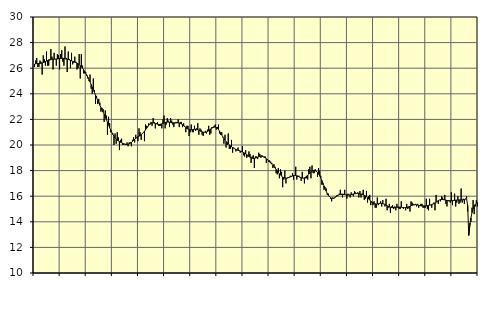
| Category | Tillverkning o utvinning, energi o miljö, SNI 05-33, 35-39 | Series 3 |
|---|---|---|
| nan | 26.1 | 26.31 |
| 87.0 | 26.6 | 26.35 |
| 87.0 | 26.8 | 26.36 |
| 87.0 | 26.1 | 26.37 |
| 87.0 | 26.1 | 26.37 |
| 87.0 | 26.6 | 26.38 |
| 87.0 | 26.5 | 26.39 |
| 87.0 | 25.5 | 26.41 |
| 87.0 | 27 | 26.44 |
| 87.0 | 26.7 | 26.47 |
| 87.0 | 26.2 | 26.51 |
| 87.0 | 27.3 | 26.56 |
| nan | 26.2 | 26.61 |
| 88.0 | 26.2 | 26.65 |
| 88.0 | 26.6 | 26.67 |
| 88.0 | 27.5 | 26.69 |
| 88.0 | 26.9 | 26.7 |
| 88.0 | 25.9 | 26.7 |
| 88.0 | 27.2 | 26.7 |
| 88.0 | 26.7 | 26.71 |
| 88.0 | 26.2 | 26.72 |
| 88.0 | 27.1 | 26.72 |
| 88.0 | 27 | 26.74 |
| 88.0 | 25.9 | 26.75 |
| nan | 27.1 | 26.76 |
| 89.0 | 27.4 | 26.77 |
| 89.0 | 26.5 | 26.77 |
| 89.0 | 26.2 | 26.76 |
| 89.0 | 27.7 | 26.74 |
| 89.0 | 26.8 | 26.72 |
| 89.0 | 25.7 | 26.7 |
| 89.0 | 27.3 | 26.68 |
| 89.0 | 26.7 | 26.65 |
| 89.0 | 26 | 26.61 |
| 89.0 | 27.2 | 26.58 |
| 89.0 | 26.3 | 26.54 |
| nan | 26.4 | 26.51 |
| 90.0 | 26.9 | 26.48 |
| 90.0 | 26.5 | 26.44 |
| 90.0 | 25.9 | 26.4 |
| 90.0 | 26 | 26.34 |
| 90.0 | 27.1 | 26.28 |
| 90.0 | 25.2 | 26.2 |
| 90.0 | 27.1 | 26.11 |
| 90.0 | 26.2 | 26.01 |
| 90.0 | 25.6 | 25.89 |
| 90.0 | 25.6 | 25.76 |
| 90.0 | 25.7 | 25.61 |
| nan | 25.4 | 25.46 |
| 91.0 | 25.2 | 25.29 |
| 91.0 | 25 | 25.1 |
| 91.0 | 25.5 | 24.92 |
| 91.0 | 24.4 | 24.73 |
| 91.0 | 24 | 24.53 |
| 91.0 | 25.2 | 24.33 |
| 91.0 | 24.3 | 24.12 |
| 91.0 | 23.2 | 23.91 |
| 91.0 | 23.8 | 23.7 |
| 91.0 | 23.2 | 23.49 |
| 91.0 | 23.6 | 23.3 |
| nan | 23.3 | 23.11 |
| 92.0 | 22.6 | 22.93 |
| 92.0 | 22.9 | 22.75 |
| 92.0 | 22.8 | 22.57 |
| 92.0 | 21.8 | 22.39 |
| 92.0 | 22.7 | 22.2 |
| 92.0 | 22.3 | 22 |
| 92.0 | 20.8 | 21.78 |
| 92.0 | 22.2 | 21.57 |
| 92.0 | 21.7 | 21.36 |
| 92.0 | 21 | 21.17 |
| 92.0 | 21 | 20.98 |
| nan | 20.9 | 20.82 |
| 93.0 | 20 | 20.68 |
| 93.0 | 20.9 | 20.56 |
| 93.0 | 20.1 | 20.46 |
| 93.0 | 21 | 20.38 |
| 93.0 | 20.6 | 20.32 |
| 93.0 | 19.6 | 20.27 |
| 93.0 | 20.4 | 20.22 |
| 93.0 | 20.5 | 20.18 |
| 93.0 | 20 | 20.13 |
| 93.0 | 20 | 20.09 |
| 93.0 | 20.1 | 20.06 |
| nan | 20 | 20.04 |
| 94.0 | 20.2 | 20.04 |
| 94.0 | 19.9 | 20.06 |
| 94.0 | 20.2 | 20.09 |
| 94.0 | 20.2 | 20.14 |
| 94.0 | 19.9 | 20.2 |
| 94.0 | 20.4 | 20.28 |
| 94.0 | 20.6 | 20.36 |
| 94.0 | 20.2 | 20.44 |
| 94.0 | 20.8 | 20.52 |
| 94.0 | 20.6 | 20.58 |
| 94.0 | 20.3 | 20.64 |
| nan | 21.3 | 20.69 |
| 95.0 | 21 | 20.74 |
| 95.0 | 20.4 | 20.8 |
| 95.0 | 20.9 | 20.88 |
| 95.0 | 21 | 20.97 |
| 95.0 | 20.3 | 21.07 |
| 95.0 | 21.6 | 21.19 |
| 95.0 | 21.5 | 21.32 |
| 95.0 | 21.4 | 21.44 |
| 95.0 | 21.7 | 21.55 |
| 95.0 | 21.6 | 21.64 |
| 95.0 | 21.8 | 21.7 |
| nan | 21.5 | 21.73 |
| 96.0 | 22.1 | 21.73 |
| 96.0 | 21.8 | 21.71 |
| 96.0 | 21.3 | 21.68 |
| 96.0 | 21.7 | 21.65 |
| 96.0 | 21.8 | 21.62 |
| 96.0 | 21.5 | 21.61 |
| 96.0 | 21.5 | 21.61 |
| 96.0 | 21.5 | 21.63 |
| 96.0 | 21.3 | 21.65 |
| 96.0 | 22 | 21.69 |
| 96.0 | 22.3 | 21.73 |
| nan | 21.3 | 21.76 |
| 97.0 | 21.6 | 21.78 |
| 97.0 | 22.1 | 21.79 |
| 97.0 | 21.9 | 21.79 |
| 97.0 | 21.4 | 21.78 |
| 97.0 | 22.1 | 21.76 |
| 97.0 | 21.9 | 21.75 |
| 97.0 | 21.6 | 21.74 |
| 97.0 | 21.4 | 21.73 |
| 97.0 | 21.7 | 21.73 |
| 97.0 | 21.8 | 21.73 |
| 97.0 | 21.8 | 21.73 |
| nan | 22 | 21.73 |
| 98.0 | 21.4 | 21.71 |
| 98.0 | 21.8 | 21.69 |
| 98.0 | 21.8 | 21.64 |
| 98.0 | 21.4 | 21.59 |
| 98.0 | 21.7 | 21.52 |
| 98.0 | 21.5 | 21.44 |
| 98.0 | 21 | 21.36 |
| 98.0 | 21.5 | 21.3 |
| 98.0 | 21.5 | 21.25 |
| 98.0 | 20.7 | 21.21 |
| 98.0 | 21 | 21.19 |
| nan | 21.6 | 21.19 |
| 99.0 | 21 | 21.2 |
| 99.0 | 21 | 21.22 |
| 99.0 | 21.5 | 21.23 |
| 99.0 | 21.1 | 21.23 |
| 99.0 | 21.3 | 21.22 |
| 99.0 | 21.7 | 21.19 |
| 99.0 | 20.8 | 21.16 |
| 99.0 | 21.3 | 21.11 |
| 99.0 | 21.2 | 21.07 |
| 99.0 | 20.8 | 21.03 |
| 99.0 | 20.7 | 21 |
| nan | 21 | 20.99 |
| 0.0 | 21.1 | 20.99 |
| 0.0 | 20.9 | 21.02 |
| 0.0 | 21.2 | 21.06 |
| 0.0 | 21.5 | 21.12 |
| 0.0 | 20.8 | 21.19 |
| 0.0 | 20.9 | 21.26 |
| 0.0 | 21.4 | 21.32 |
| 0.0 | 21.4 | 21.37 |
| 0.0 | 21.5 | 21.4 |
| 0.0 | 21.6 | 21.4 |
| 0.0 | 21.2 | 21.37 |
| nan | 21.4 | 21.3 |
| 1.0 | 21.6 | 21.21 |
| 1.0 | 20.9 | 21.08 |
| 1.0 | 20.8 | 20.94 |
| 1.0 | 21 | 20.79 |
| 1.0 | 20.6 | 20.64 |
| 1.0 | 20.1 | 20.5 |
| 1.0 | 20.8 | 20.38 |
| 1.0 | 19.8 | 20.27 |
| 1.0 | 20 | 20.18 |
| 1.0 | 20.9 | 20.09 |
| 1.0 | 19.7 | 20.01 |
| nan | 19.7 | 19.94 |
| 2.0 | 20.4 | 19.87 |
| 2.0 | 19.4 | 19.8 |
| 2.0 | 19.8 | 19.75 |
| 2.0 | 19.7 | 19.7 |
| 2.0 | 19.5 | 19.66 |
| 2.0 | 19.6 | 19.62 |
| 2.0 | 19.8 | 19.59 |
| 2.0 | 19.6 | 19.56 |
| 2.0 | 19.4 | 19.53 |
| 2.0 | 19.5 | 19.5 |
| 2.0 | 19.9 | 19.46 |
| nan | 19.2 | 19.42 |
| 3.0 | 19.1 | 19.37 |
| 3.0 | 19.6 | 19.31 |
| 3.0 | 19 | 19.25 |
| 3.0 | 19.1 | 19.18 |
| 3.0 | 19.5 | 19.11 |
| 3.0 | 19.3 | 19.05 |
| 3.0 | 18.6 | 19 |
| 3.0 | 19.1 | 18.97 |
| 3.0 | 19.2 | 18.95 |
| 3.0 | 18.2 | 18.96 |
| 3.0 | 19.1 | 18.98 |
| nan | 19.1 | 19.01 |
| 4.0 | 18.9 | 19.05 |
| 4.0 | 19.4 | 19.09 |
| 4.0 | 19.3 | 19.12 |
| 4.0 | 19 | 19.13 |
| 4.0 | 19.2 | 19.12 |
| 4.0 | 19.1 | 19.09 |
| 4.0 | 19.1 | 19.04 |
| 4.0 | 19.1 | 18.99 |
| 4.0 | 18.6 | 18.92 |
| 4.0 | 18.9 | 18.85 |
| 4.0 | 18.7 | 18.77 |
| nan | 18.8 | 18.69 |
| 5.0 | 18.7 | 18.6 |
| 5.0 | 18.6 | 18.51 |
| 5.0 | 18.2 | 18.42 |
| 5.0 | 18.5 | 18.31 |
| 5.0 | 18.3 | 18.2 |
| 5.0 | 17.8 | 18.09 |
| 5.0 | 17.7 | 17.97 |
| 5.0 | 18.2 | 17.86 |
| 5.0 | 17.4 | 17.75 |
| 5.0 | 18.1 | 17.65 |
| 5.0 | 17.9 | 17.57 |
| nan | 16.7 | 17.5 |
| 6.0 | 17.3 | 17.45 |
| 6.0 | 18 | 17.42 |
| 6.0 | 17 | 17.41 |
| 6.0 | 17.4 | 17.41 |
| 6.0 | 17.5 | 17.44 |
| 6.0 | 17.5 | 17.47 |
| 6.0 | 17.6 | 17.51 |
| 6.0 | 17.5 | 17.55 |
| 6.0 | 17.8 | 17.58 |
| 6.0 | 17.3 | 17.61 |
| 6.0 | 17.6 | 17.62 |
| nan | 18.3 | 17.62 |
| 7.0 | 17.3 | 17.6 |
| 7.0 | 17.5 | 17.57 |
| 7.0 | 17.6 | 17.53 |
| 7.0 | 17.5 | 17.48 |
| 7.0 | 17.2 | 17.44 |
| 7.0 | 17.9 | 17.42 |
| 7.0 | 17.4 | 17.41 |
| 7.0 | 17 | 17.44 |
| 7.0 | 17.4 | 17.49 |
| 7.0 | 17.4 | 17.56 |
| 7.0 | 17.3 | 17.65 |
| nan | 18.1 | 17.73 |
| 8.0 | 18.3 | 17.82 |
| 8.0 | 17.4 | 17.9 |
| 8.0 | 18.4 | 17.97 |
| 8.0 | 17.8 | 18.01 |
| 8.0 | 17.8 | 18.02 |
| 8.0 | 18.1 | 18 |
| 8.0 | 17.9 | 17.95 |
| 8.0 | 17.5 | 17.86 |
| 8.0 | 18.2 | 17.73 |
| 8.0 | 18 | 17.59 |
| 8.0 | 17.6 | 17.42 |
| nan | 16.9 | 17.23 |
| 9.0 | 16.9 | 17.02 |
| 9.0 | 16.5 | 16.8 |
| 9.0 | 16.7 | 16.59 |
| 9.0 | 16.6 | 16.39 |
| 9.0 | 16.1 | 16.21 |
| 9.0 | 16.2 | 16.07 |
| 9.0 | 16 | 15.96 |
| 9.0 | 15.8 | 15.88 |
| 9.0 | 15.6 | 15.84 |
| 9.0 | 15.9 | 15.84 |
| 9.0 | 15.8 | 15.85 |
| nan | 15.9 | 15.89 |
| 10.0 | 16 | 15.95 |
| 10.0 | 16.1 | 16.01 |
| 10.0 | 16.1 | 16.07 |
| 10.0 | 16.2 | 16.12 |
| 10.0 | 16.5 | 16.15 |
| 10.0 | 16.1 | 16.16 |
| 10.0 | 15.9 | 16.16 |
| 10.0 | 16.1 | 16.15 |
| 10.0 | 16.5 | 16.13 |
| 10.0 | 16.1 | 16.11 |
| 10.0 | 15.8 | 16.1 |
| nan | 16.2 | 16.08 |
| 11.0 | 16.1 | 16.09 |
| 11.0 | 15.9 | 16.11 |
| 11.0 | 16.3 | 16.12 |
| 11.0 | 16.1 | 16.15 |
| 11.0 | 16 | 16.17 |
| 11.0 | 16.4 | 16.19 |
| 11.0 | 16.3 | 16.2 |
| 11.0 | 16.2 | 16.21 |
| 11.0 | 16.3 | 16.21 |
| 11.0 | 15.9 | 16.2 |
| 11.0 | 16.4 | 16.18 |
| nan | 15.9 | 16.16 |
| 12.0 | 16.2 | 16.14 |
| 12.0 | 16.5 | 16.11 |
| 12.0 | 15.7 | 16.07 |
| 12.0 | 15.8 | 16.02 |
| 12.0 | 16.4 | 15.96 |
| 12.0 | 15.5 | 15.88 |
| 12.0 | 16 | 15.79 |
| 12.0 | 16.1 | 15.7 |
| 12.0 | 15.3 | 15.61 |
| 12.0 | 15.5 | 15.54 |
| 12.0 | 15.3 | 15.47 |
| nan | 15.6 | 15.43 |
| 13.0 | 15.1 | 15.4 |
| 13.0 | 15.1 | 15.39 |
| 13.0 | 15.9 | 15.4 |
| 13.0 | 15.3 | 15.42 |
| 13.0 | 15.4 | 15.44 |
| 13.0 | 15.6 | 15.45 |
| 13.0 | 15.2 | 15.44 |
| 13.0 | 15.7 | 15.42 |
| 13.0 | 15.4 | 15.39 |
| 13.0 | 15.2 | 15.35 |
| 13.0 | 15.8 | 15.3 |
| nan | 14.9 | 15.25 |
| 14.0 | 15.1 | 15.2 |
| 14.0 | 15.4 | 15.16 |
| 14.0 | 14.7 | 15.14 |
| 14.0 | 15.2 | 15.12 |
| 14.0 | 15.3 | 15.11 |
| 14.0 | 15 | 15.11 |
| 14.0 | 15.2 | 15.12 |
| 14.0 | 14.9 | 15.13 |
| 14.0 | 15.4 | 15.14 |
| 14.0 | 15.1 | 15.15 |
| 14.0 | 15 | 15.15 |
| nan | 15 | 15.15 |
| 15.0 | 15.6 | 15.14 |
| 15.0 | 15.1 | 15.12 |
| 15.0 | 15 | 15.11 |
| 15.0 | 15.1 | 15.11 |
| 15.0 | 14.9 | 15.11 |
| 15.0 | 15.4 | 15.12 |
| 15.0 | 15 | 15.15 |
| 15.0 | 15.1 | 15.18 |
| 15.0 | 14.8 | 15.21 |
| 15.0 | 15.6 | 15.25 |
| 15.0 | 15.5 | 15.29 |
| nan | 15.4 | 15.32 |
| 16.0 | 15.3 | 15.33 |
| 16.0 | 15.4 | 15.34 |
| 16.0 | 15.2 | 15.33 |
| 16.0 | 15.4 | 15.31 |
| 16.0 | 15.1 | 15.29 |
| 16.0 | 15.3 | 15.27 |
| 16.0 | 15.4 | 15.25 |
| 16.0 | 15.4 | 15.24 |
| 16.0 | 15.1 | 15.24 |
| 16.0 | 15.1 | 15.24 |
| 16.0 | 15.1 | 15.24 |
| nan | 15.8 | 15.25 |
| 17.0 | 15 | 15.26 |
| 17.0 | 14.9 | 15.28 |
| 17.0 | 15.8 | 15.3 |
| 17.0 | 15.3 | 15.32 |
| 17.0 | 15.1 | 15.35 |
| 17.0 | 15.4 | 15.38 |
| 17.0 | 15.5 | 15.42 |
| 17.0 | 14.9 | 15.47 |
| 17.0 | 16.1 | 15.53 |
| 17.0 | 15.6 | 15.59 |
| 17.0 | 15.4 | 15.65 |
| nan | 15.7 | 15.7 |
| 18.0 | 15.6 | 15.73 |
| 18.0 | 16 | 15.74 |
| 18.0 | 15.9 | 15.74 |
| 18.0 | 15.7 | 15.73 |
| 18.0 | 16.1 | 15.71 |
| 18.0 | 15.4 | 15.69 |
| 18.0 | 15.2 | 15.67 |
| 18.0 | 15.7 | 15.66 |
| 18.0 | 15.6 | 15.65 |
| 18.0 | 15.5 | 15.64 |
| 18.0 | 16.3 | 15.64 |
| nan | 15.3 | 15.65 |
| 19.0 | 15.7 | 15.67 |
| 19.0 | 16.2 | 15.68 |
| 19.0 | 15.2 | 15.69 |
| 19.0 | 15.5 | 15.7 |
| 19.0 | 16 | 15.71 |
| 19.0 | 15.4 | 15.71 |
| 19.0 | 15.5 | 15.71 |
| 19.0 | 16.6 | 15.71 |
| 19.0 | 15.5 | 15.71 |
| 19.0 | 15.8 | 15.72 |
| 19.0 | 15.4 | 15.74 |
| nan | 15.8 | 15.77 |
| 20.0 | 16 | 15.81 |
| 20.0 | 14.8 | 15.27 |
| 20.0 | 13 | 12.94 |
| 20.0 | 13.9 | 13.73 |
| 20.0 | 14 | 14.3 |
| 20.0 | 15.1 | 14.72 |
| 20.0 | 15.7 | 15.02 |
| 20.0 | 14.6 | 15.22 |
| 20.0 | 15.2 | 15.36 |
| 20.0 | 15.7 | 15.45 |
| 20.0 | 15.2 | 15.51 |